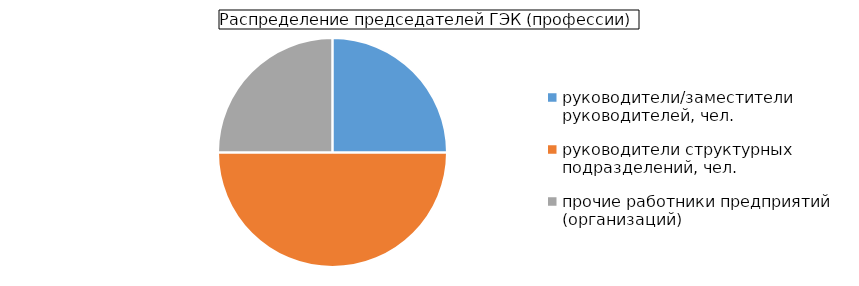
| Category | Series 1 |
|---|---|
| руководители/заместители руководителей, чел. | 2 |
| руководители структурных подразделений, чел. | 4 |
| прочие работники предприятий (организаций) | 2 |